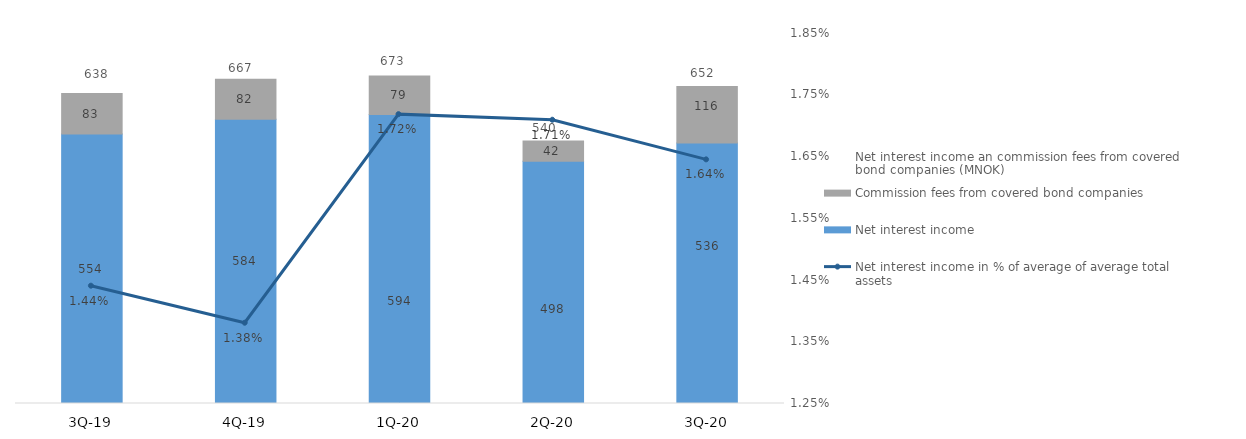
| Category | Net interest income | Commission fees from covered bond companies |
|---|---|---|
| 3Q-20 | 535.786 | 116.034 |
| 2Q-20 | 498.097 | 41.55 |
| 1Q-20 | 594.469 | 78.983 |
| 4Q-19 | 584.355 | 82.264 |
| 3Q-19 | 554.269 | 83.345 |